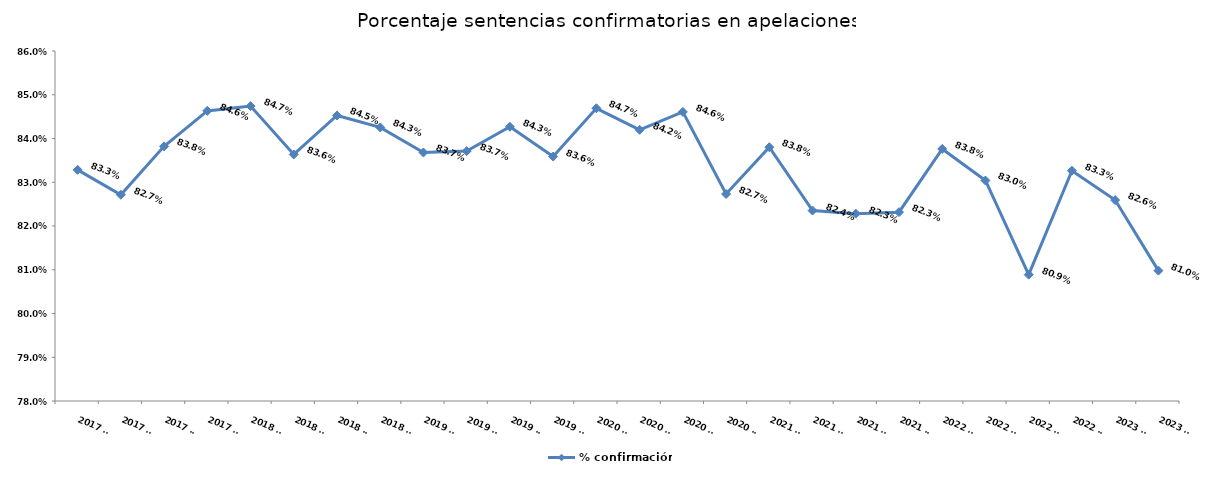
| Category | % confirmación |
|---|---|
| 2017 T1 | 0.833 |
| 2017 T2 | 0.827 |
| 2017 T3 | 0.838 |
| 2017 T4 | 0.846 |
| 2018 T1 | 0.847 |
| 2018 T2 | 0.836 |
| 2018 T3 | 0.845 |
| 2018 T4 | 0.843 |
| 2019 T1 | 0.837 |
| 2019 T2 | 0.837 |
| 2019 T3 | 0.843 |
| 2019 T4 | 0.836 |
| 2020 T1 | 0.847 |
| 2020 T2 | 0.842 |
| 2020 T3 | 0.846 |
| 2020 T4 | 0.827 |
| 2021 T1 | 0.838 |
| 2021 T2 | 0.824 |
| 2021 T3 | 0.823 |
| 2021 T4 | 0.823 |
| 2022 T1 | 0.838 |
| 2022 T2 | 0.83 |
| 2022 T3 | 0.809 |
| 2022 T4 | 0.833 |
| 2023 T1 | 0.826 |
| 2023 T2 | 0.81 |